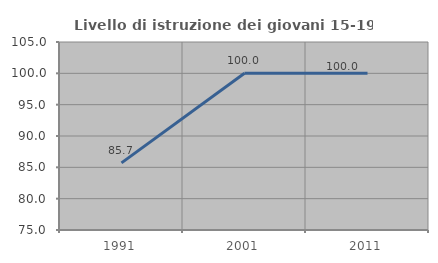
| Category | Livello di istruzione dei giovani 15-19 anni |
|---|---|
| 1991.0 | 85.714 |
| 2001.0 | 100 |
| 2011.0 | 100 |